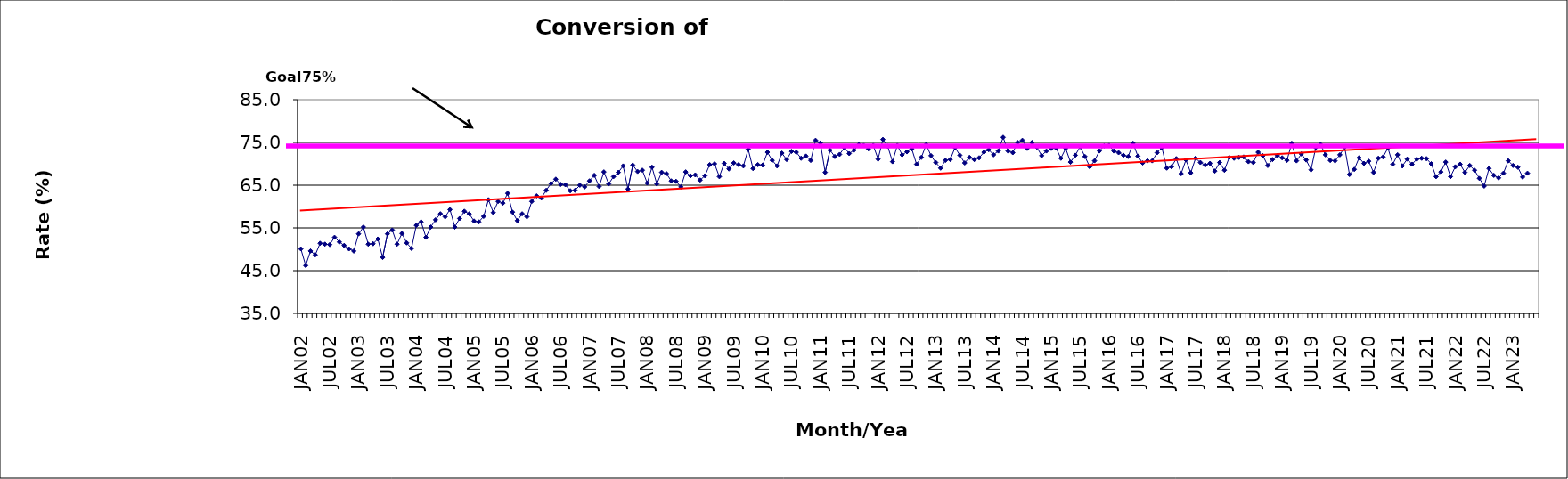
| Category | Series 0 |
|---|---|
| JAN02 | 50.1 |
| FEB02 | 46.2 |
| MAR02 | 49.6 |
| APR02 | 48.7 |
| MAY02 | 51.4 |
| JUN02 | 51.2 |
| JUL02 | 51.1 |
| AUG02 | 52.8 |
| SEP02 | 51.7 |
| OCT02 | 50.9 |
| NOV02 | 50.1 |
| DEC02 | 49.6 |
| JAN03 | 53.6 |
| FEB03 | 55.2 |
| MAR03 | 51.2 |
| APR03 | 51.3 |
| MAY03 | 52.4 |
| JUN03 | 48.1 |
| JUL03 | 53.6 |
| AUG03 | 54.5 |
| SEP03 | 51.2 |
| OCT03 | 53.7 |
| NOV03 | 51.5 |
| DEC03 | 50.2 |
| JAN04 | 55.6 |
| FEB04 | 56.4 |
| MAR04 | 52.8 |
| APR04 | 55.2 |
| MAY04 | 56.9 |
| JUN04 | 58.3 |
| JUL04 | 57.6 |
| AUG04 | 59.3 |
| SEP04 | 55.2 |
| OCT04 | 57.2 |
| NOV04 | 58.9 |
| DEC04 | 58.3 |
| JAN05 | 56.6 |
| FEB05 | 56.4 |
| MAR05 | 57.7 |
| APR05 | 61.6 |
| MAY05 | 58.6 |
| JUN05 | 61.2 |
| JUL05 | 60.8 |
| AUG05 | 63.1 |
| SEP05 | 58.7 |
| OCT05 | 56.7 |
| NOV05 | 58.3 |
| DEC05 | 57.6 |
| JAN06 | 61.2 |
| FEB06 | 62.5 |
| MAR06 | 62 |
| APR06 | 63.8 |
| MAY06 | 65.4 |
| JUN06 | 66.4 |
| JUL06 | 65.2 |
| AUG06 | 65.1 |
| SEP06 | 63.7 |
| OCT06 | 63.8 |
| NOV06 | 65 |
| DEC06 | 64.6 |
| JAN07 | 66 |
| FEB07 | 67.3 |
| MAR07 | 64.7 |
| APR07 | 68.1 |
| MAY07 | 65.3 |
| JUN07 | 67 |
| JUL07 | 68 |
| AUG07 | 69.5 |
| SEP07 | 64.1 |
| OCT07 | 69.7 |
| NOV07 | 68.2 |
| DEC07 | 68.5 |
| JAN08 | 65.5 |
| FEB08 | 69.2 |
| MAR08 | 65.3 |
| APR08 | 68 |
| MAY08 | 67.7 |
| JUN08 | 66 |
| JUL08 | 65.9 |
| AUG08 | 64.6 |
| SEP08 | 68.1 |
| OCT08 | 67.2 |
| NOV08 | 67.4 |
| DEC08 | 66.2 |
| JAN09 | 67.2 |
| FEB09 | 69.8 |
| MAR09 | 70 |
| APR09 | 67 |
| MAY09 | 70.1 |
| JUN09 | 68.8 |
| JUL09 | 70.2 |
| AUG09 | 69.8 |
| SEP09 | 69.5 |
| OCT09 | 73.4 |
| NOV09 | 68.9 |
| DEC09 | 69.8 |
| JAN10 | 69.7 |
| FEB10 | 72.7 |
| MAR10 | 70.8 |
| APR10 | 69.5 |
| MAY10 | 72.5 |
| JUN10 | 71 |
| JUL10 | 72.9 |
| AUG10 | 72.7 |
| SEP10 | 71.3 |
| OCT10 | 71.8 |
| NOV10 | 70.8 |
| DEC10 | 75.5 |
| JAN11 | 74.9 |
| FEB11 | 68 |
| MAR11 | 73.2 |
| APR11 | 71.7 |
| MAY11 | 72.2 |
| JUN11 | 73.8 |
| JUL11 | 72.4 |
| AUG11 | 73.2 |
| SEP11 | 74.5 |
| OCT11 | 74.3 |
| NOV11 | 73.5 |
| DEC11 | 74.3 |
| JAN12 | 71.1 |
| FEB12 | 75.7 |
| MAR12 | 74.1 |
| APR12 | 70.5 |
| MAY12 | 74.3 |
| JUN12 | 72.1 |
| JUL12 | 72.8 |
| AUG12 | 73.5 |
| SEP12 | 69.9 |
| OCT12 | 71.5 |
| NOV12 | 74.5 |
| DEC12 | 71.9 |
| JAN13 | 70.3 |
| FEB13 | 69 |
| MAR13 | 70.8 |
| APR13 | 71 |
| MAY13 | 73.8 |
| JUN13 | 72 |
| JUL13 | 70.2 |
| AUG13 | 71.5 |
| SEP13 | 71 |
| OCT13 | 71.4 |
| NOV13 | 72.7 |
| DEC13 | 73.3 |
| JAN14 | 72.1 |
| FEB14 | 73 |
| MAR14 | 76.2 |
| APR14 | 73 |
| MAY14 | 72.6 |
| JUN14 | 75 |
| JUL14 | 75.5 |
| AUG14 | 73.6 |
| SEP14 | 75 |
| OCT14 | 73.9 |
| NOV14 | 71.9 |
| DEC14 | 73 |
| JAN15 | 73.6 |
| FEB15 | 73.7 |
| MAR15 | 71.3 |
| APR15 | 73.6 |
| MAY15 | 70.4 |
| JUN15 | 72 |
| JUL15 | 74 |
| AUG15 | 71.7 |
| SEP15 | 69.3 |
| OCT15 | 70.7 |
| NOV15 | 73 |
| DEC15 | 74.2 |
| JAN16 | 74.3 |
| FEB16 | 73 |
| MAR16 | 72.6 |
| APR16 | 72 |
| MAY16 | 71.7 |
| JUN16 | 74.8 |
| JUL16 | 71.8 |
| AUG16 | 70.2 |
| SEP16 | 70.7 |
| OCT16 | 70.7 |
| NOV16 | 72.6 |
| DEC16 | 73.8 |
| JAN17 | 69 |
| FEB17 | 69.3 |
| MAR17 | 71.2 |
| APR17 | 67.7 |
| MAY17 | 70.9 |
| JUN17 | 67.9 |
| JUL17 | 71.3 |
| AUG17 | 70.3 |
| SEP17 | 69.7 |
| OCT17 | 70.1 |
| NOV17 | 68.3 |
| DEC17 | 70.3 |
| JAN18 | 68.5 |
| FEB18 | 71.5 |
| MAR18 | 71.3 |
| APR18 | 71.5 |
| MAY18 | 71.6 |
| JUN18 | 70.5 |
| JUL18 | 70.3 |
| AUG18 | 72.7 |
| SEP18 | 71.9 |
| OCT18 | 69.6 |
| NOV18 | 71 |
| DEC18 | 71.9 |
| JAN19 | 71.4 |
| FEB19 | 70.8 |
| MAR19 | 74.8 |
| APR19 | 70.7 |
| MAY19 | 72.3 |
| JUN19 | 70.9 |
| JUL19 | 68.6 |
| AUG19 | 73.8 |
| SEP19 | 74.5 |
| OCT19 | 72.1 |
| NOV19 | 70.8 |
| DEC19 | 70.7 |
| JAN20 | 72.1 |
| FEB20 | 73.9 |
| MAR20 | 67.5 |
| APR20 | 68.7 |
| MAY20 | 71.4 |
| JUN20 | 70.1 |
| JUL20 | 70.6 |
| AUG20 | 68 |
| SEP20 | 71.3 |
| OCT20 | 71.6 |
| NOV20 | 73.7 |
| DEC20 | 69.9 |
| JAN21 | 72.1 |
| FEB21 | 69.5 |
| MAR21 | 71.1 |
| APR21 | 69.9 |
| MAY21 | 71.1 |
| JUN21 | 71.3 |
| JUL21 | 71.2 |
| AUG21 | 70 |
| SEP21 | 67 |
| OCT21 | 68.1 |
| NOV21 | 70.4 |
| DEC21 | 67 |
| JAN22 | 69.3 |
| FEB22 | 69.9 |
| MAR22 | 68 |
| APR22 | 69.6 |
| MAY22 | 68.5 |
| JUN22 | 66.6 |
| JUL22 | 64.8 |
| AUG22 | 68.9 |
| SEP22 | 67.3 |
| OCT22 | 66.7 |
| NOV22 | 67.8 |
| DEC22 | 70.7 |
| JAN23 | 69.6 |
| FEB23 | 69.2 |
| MAR23 | 66.9 |
| APR23 | 67.8 |